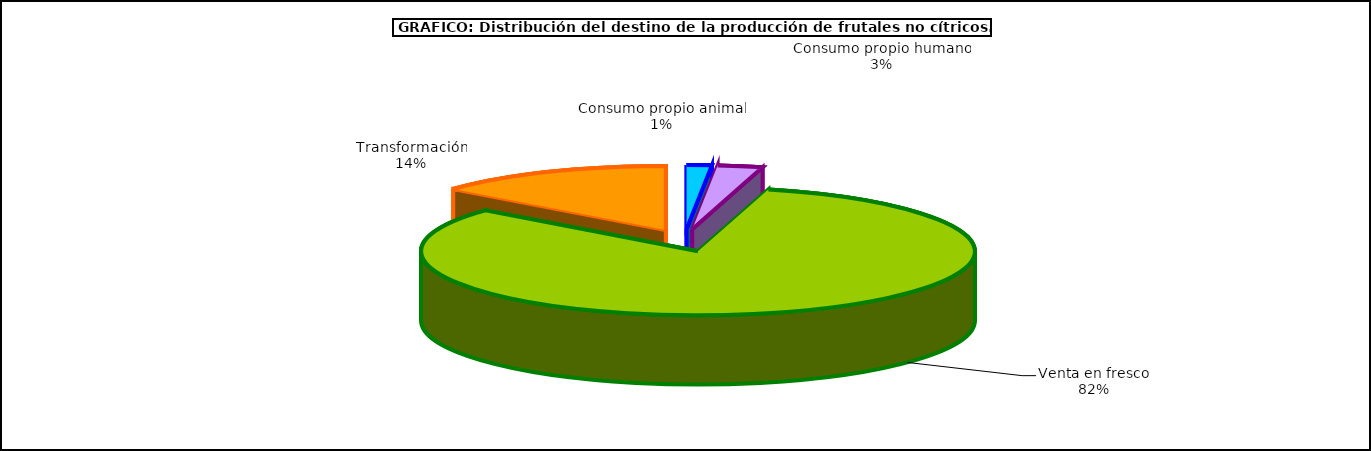
| Category | frutales no cítricos |
|---|---|
| 0 | 63006 |
| 1 | 113238 |
| 2 | 3535546 |
| 3 | 600574 |